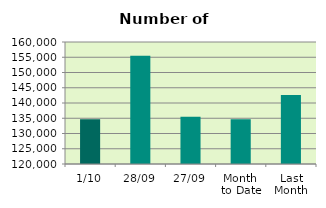
| Category | Series 0 |
|---|---|
| 1/10 | 134682 |
| 28/09 | 155480 |
| 27/09 | 135522 |
| Month 
to Date | 134682 |
| Last
Month | 142606.2 |